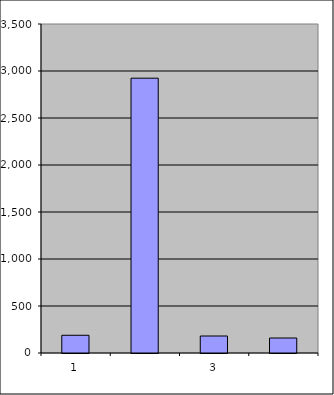
| Category | Series 0 |
|---|---|
| 0 | 188.5 |
| 1 | 2923.482 |
| 2 | 180.848 |
| 3 | 159.544 |